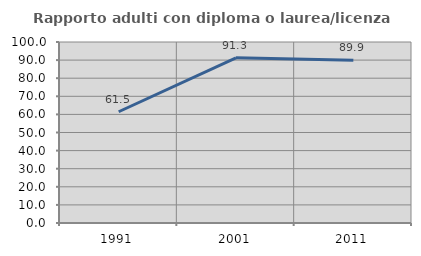
| Category | Rapporto adulti con diploma o laurea/licenza media  |
|---|---|
| 1991.0 | 61.458 |
| 2001.0 | 91.254 |
| 2011.0 | 89.858 |